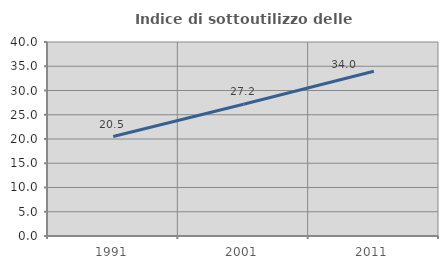
| Category | Indice di sottoutilizzo delle abitazioni  |
|---|---|
| 1991.0 | 20.505 |
| 2001.0 | 27.178 |
| 2011.0 | 33.955 |